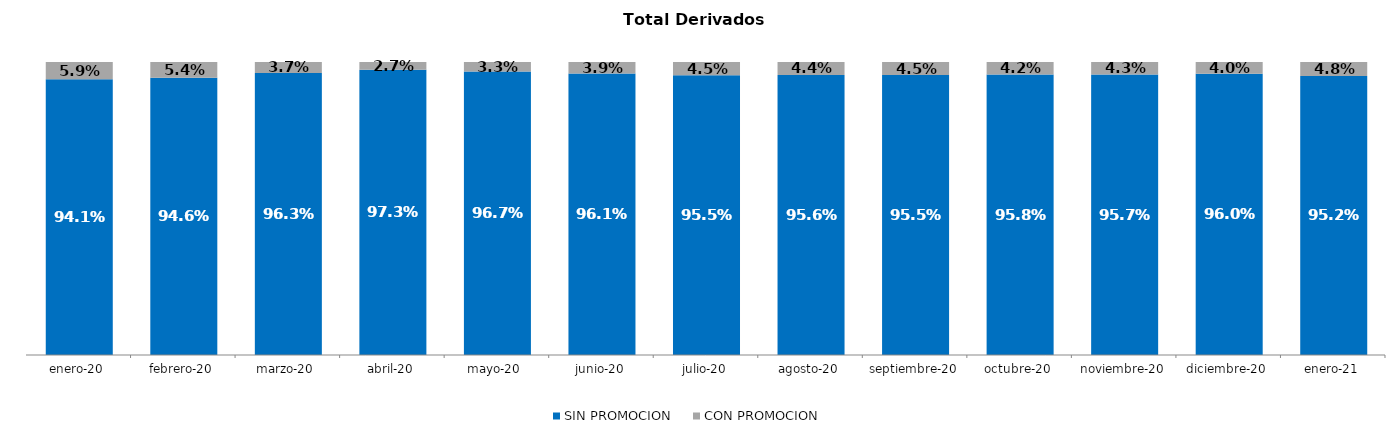
| Category | SIN PROMOCION   | CON PROMOCION   |
|---|---|---|
| 2020-01-01 | 0.941 | 0.059 |
| 2020-02-01 | 0.946 | 0.054 |
| 2020-03-01 | 0.963 | 0.037 |
| 2020-04-01 | 0.973 | 0.027 |
| 2020-05-01 | 0.967 | 0.033 |
| 2020-06-01 | 0.961 | 0.039 |
| 2020-07-01 | 0.955 | 0.045 |
| 2020-08-01 | 0.956 | 0.044 |
| 2020-09-01 | 0.955 | 0.045 |
| 2020-10-01 | 0.958 | 0.042 |
| 2020-11-01 | 0.957 | 0.043 |
| 2020-12-01 | 0.96 | 0.04 |
| 2021-01-01 | 0.952 | 0.048 |